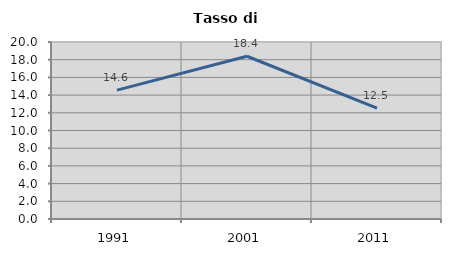
| Category | Tasso di disoccupazione   |
|---|---|
| 1991.0 | 14.566 |
| 2001.0 | 18.389 |
| 2011.0 | 12.527 |